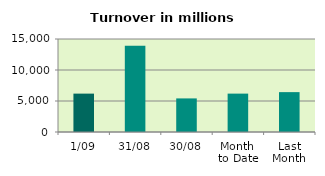
| Category | Series 0 |
|---|---|
| 1/09 | 6190.763 |
| 31/08 | 13896.487 |
| 30/08 | 5417.593 |
| Month 
to Date | 6190.763 |
| Last
Month | 6430.895 |